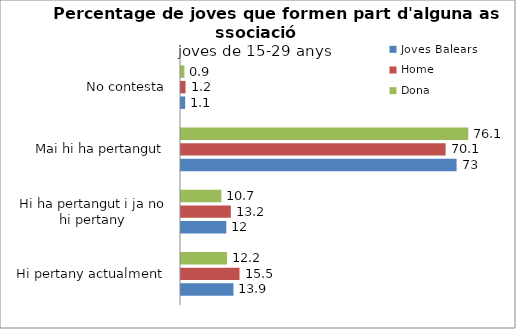
| Category | Joves Balears | Home | Dona |
|---|---|---|---|
| Hi pertany actualment | 13.9 | 15.5 | 12.2 |
| Hi ha pertangut i ja no hi pertany | 12 | 13.2 | 10.7 |
| Mai hi ha pertangut | 73 | 70.1 | 76.1 |
| No contesta | 1.1 | 1.2 | 0.9 |